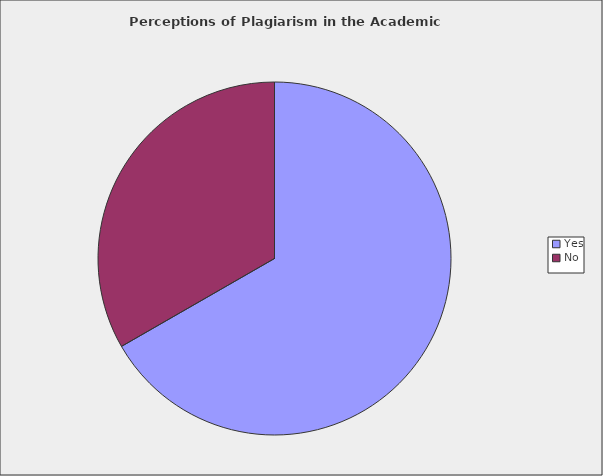
| Category | Series 0 |
|---|---|
| Yes | 0.667 |
| No | 0.333 |